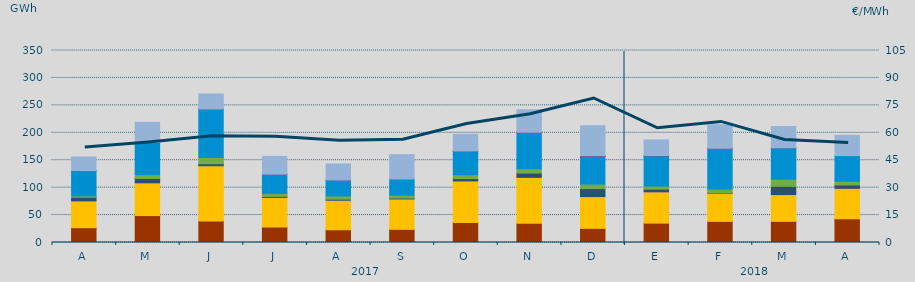
| Category | Carbón | Ciclo Combinado | Cogeneración | Consumo Bombeo | Eólica | Fuel-Gas | Hidráulica | Nuclear | Otras Renovables | Turbinación bombeo |
|---|---|---|---|---|---|---|---|---|---|---|
| A | 26944.8 | 48899.3 | 13.6 | 6553.1 | 2541.5 | 0 | 45882.6 | 122 | 0 | 24942.1 |
| M | 49018.7 | 59814.3 | 7.3 | 7845.9 | 7018.8 | 0 | 58284.6 | 169.5 | 0 | 36979 |
| J | 39223.4 | 100710.5 | 17.3 | 3498.8 | 11518.7 | 0 | 88256.3 | 69.8 | 0 | 27501.3 |
| J | 28227.7 | 53992.1 | 2.7 | 1736.9 | 5554.8 | 0 | 34688.7 | 310 | 0 | 32397.1 |
| A | 23185.3 | 53888.3 | 1.1 | 1823.4 | 5883.3 | 0 | 29023.6 | 148 | 0 | 29140 |
| S | 23990.4 | 55429.2 | 0.8 | 1551.4 | 5247.3 | 0 | 29358.5 | 3.1 | 0 | 44532.5 |
| O | 36235.6 | 75955.4 | 2 | 4285.9 | 7050.1 | 0 | 42190.9 | 700 | 131.3 | 30549.8 |
| N | 35124.9 | 83653.4 | 0 | 7774.4 | 7943.5 | 0 | 66112.3 | 0 | 299.1 | 41077.1 |
| D | 25784.6 | 57877.3 | 0 | 14602.9 | 8236.4 | 0 | 50297.7 | 1085.4 | 57.5 | 54906.6 |
| E | 35353.2 | 57056.1 | 10.8 | 4781.6 | 5669.6 | 0 | 55012.6 | 282.3 | 69.8 | 28937.8 |
| F | 38501.6 | 51366.4 | 3 | 876.5 | 6719.4 | 0 | 74091.8 | 129.7 | 8.1 | 42931.7 |
| M | 38546.8 | 48796.7 | 0 | 14986.9 | 13034.1 | 0 | 57129.4 | 0 | 7.9 | 39005.1 |
| A | 43196.7 | 55522.2 | 0 | 6134.1 | 6758.4 | 0 | 46798.3 | 0 | 0 | 36861.2 |